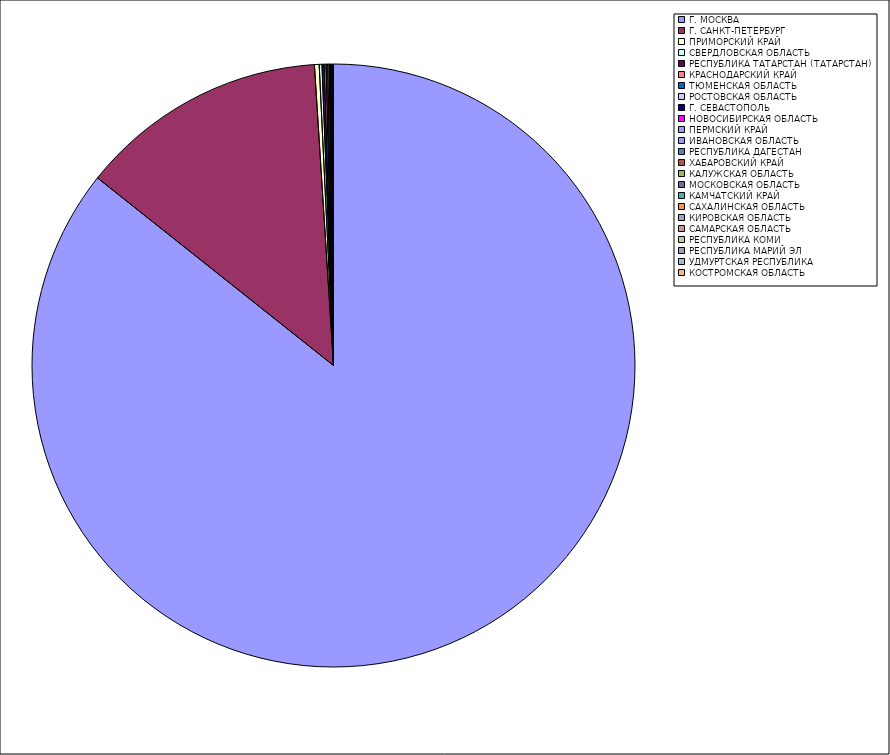
| Category | Оборот |
|---|---|
| Г. МОСКВА | 85.648 |
| Г. САНКТ-ПЕТЕРБУРГ | 13.296 |
| ПРИМОРСКИЙ КРАЙ | 0.252 |
| СВЕРДЛОВСКАЯ ОБЛАСТЬ | 0.148 |
| РЕСПУБЛИКА ТАТАРСТАН (ТАТАРСТАН) | 0.116 |
| КРАСНОДАРСКИЙ КРАЙ | 0.099 |
| ТЮМЕНСКАЯ ОБЛАСТЬ | 0.086 |
| РОСТОВСКАЯ ОБЛАСТЬ | 0.075 |
| Г. СЕВАСТОПОЛЬ | 0.04 |
| НОВОСИБИРСКАЯ ОБЛАСТЬ | 0.027 |
| ПЕРМСКИЙ КРАЙ | 0.026 |
| ИВАНОВСКАЯ ОБЛАСТЬ | 0.023 |
| РЕСПУБЛИКА ДАГЕСТАН | 0.016 |
| ХАБАРОВСКИЙ КРАЙ | 0.015 |
| КАЛУЖСКАЯ ОБЛАСТЬ | 0.013 |
| МОСКОВСКАЯ ОБЛАСТЬ | 0.012 |
| КАМЧАТСКИЙ КРАЙ | 0.01 |
| САХАЛИНСКАЯ ОБЛАСТЬ | 0.009 |
| КИРОВСКАЯ ОБЛАСТЬ | 0.009 |
| САМАРСКАЯ ОБЛАСТЬ | 0.009 |
| РЕСПУБЛИКА КОМИ | 0.008 |
| РЕСПУБЛИКА МАРИЙ ЭЛ | 0.006 |
| УДМУРТСКАЯ РЕСПУБЛИКА | 0.006 |
| КОСТРОМСКАЯ ОБЛАСТЬ | 0.005 |